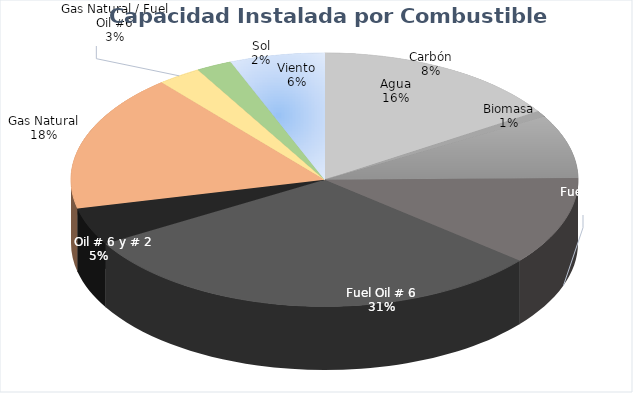
| Category | Potencia  (MW) | % |
|---|---|---|
| Agua | 615.7 | 0.159 |
| Biomasa | 30 | 0.008 |
| Carbón | 313.6 | 0.081 |
| Fuel Oil # 2 | 434.5 | 0.112 |
| Fuel Oil # 6 | 1180.9 | 0.305 |
| Fuel Oil # 6 y # 2 | 185 | 0.048 |
| Gas Natural | 678.3 | 0.175 |
| Gas Natural / Fuel Oil #6 | 108 | 0.028 |
| Sol | 88 | 0.023 |
| Viento | 233.5 | 0.06 |